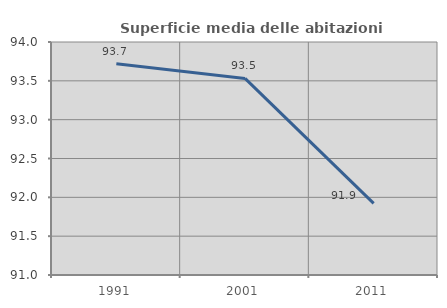
| Category | Superficie media delle abitazioni occupate |
|---|---|
| 1991.0 | 93.719 |
| 2001.0 | 93.531 |
| 2011.0 | 91.922 |